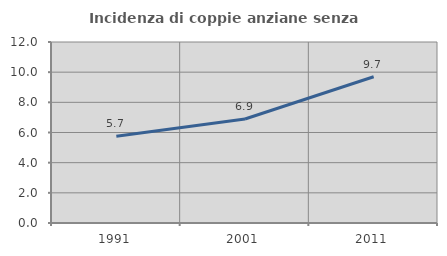
| Category | Incidenza di coppie anziane senza figli  |
|---|---|
| 1991.0 | 5.748 |
| 2001.0 | 6.893 |
| 2011.0 | 9.699 |